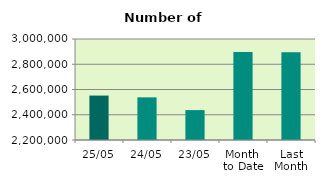
| Category | Series 0 |
|---|---|
| 25/05 | 2551900 |
| 24/05 | 2537730 |
| 23/05 | 2436926 |
| Month 
to Date | 2897103.889 |
| Last
Month | 2895009.158 |